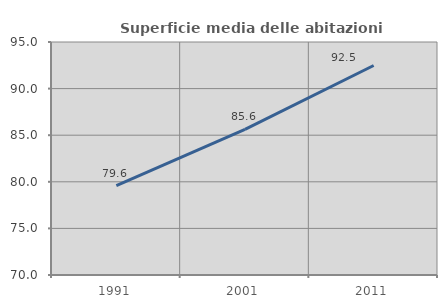
| Category | Superficie media delle abitazioni occupate |
|---|---|
| 1991.0 | 79.578 |
| 2001.0 | 85.623 |
| 2011.0 | 92.477 |